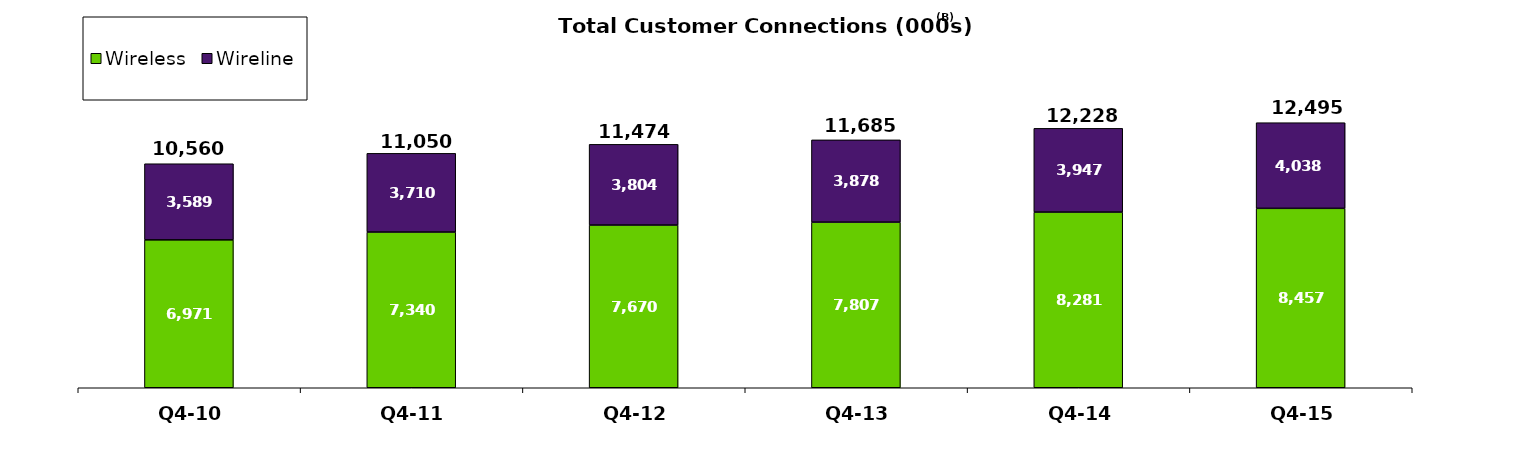
| Category | Wireless | Wireline |
|---|---|---|
| Q4-10 | 6971 | 3589 |
| Q4-11 | 7340 | 3710 |
| Q4-12 | 7670 | 3804 |
| Q4-13 | 7807 | 3878 |
| Q4-14 | 8281 | 3947 |
| Q4-15 | 8457 | 4038 |